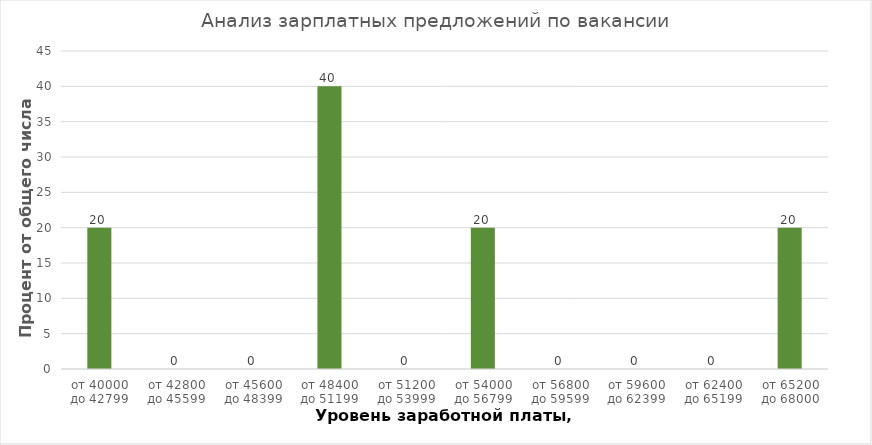
| Category | 40 000 |
|---|---|
| от 40000 до 42799 | 20 |
| от 42800 до 45599 | 0 |
| от 45600 до 48399 | 0 |
| от 48400 до 51199 | 40 |
| от 51200 до 53999 | 0 |
| от 54000 до 56799 | 20 |
| от 56800 до 59599 | 0 |
| от 59600 до 62399 | 0 |
| от 62400 до 65199 | 0 |
| от 65200 до 68000 | 20 |